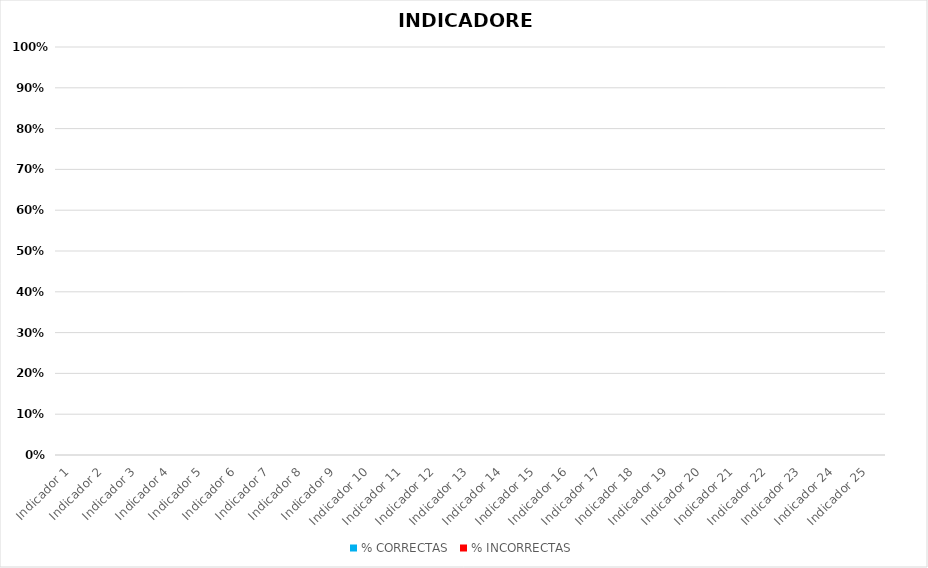
| Category | % CORRECTAS | % INCORRECTAS |
|---|---|---|
| Indicador 1 | 0 | 0 |
| Indicador 2 | 0 | 0 |
| Indicador 3 | 0 | 0 |
| Indicador 4 | 0 | 0 |
| Indicador 5 | 0 | 0 |
| Indicador 6 | 0 | 0 |
| Indicador 7 | 0 | 0 |
| Indicador 8 | 0 | 0 |
| Indicador 9 | 0 | 0 |
| Indicador 10 | 0 | 0 |
| Indicador 11 | 0 | 0 |
| Indicador 12 | 0 | 0 |
| Indicador 13 | 0 | 0 |
| Indicador 14 | 0 | 0 |
| Indicador 15 | 0 | 0 |
| Indicador 16 | 0 | 0 |
| Indicador 17 | 0 | 0 |
| Indicador 18 | 0 | 0 |
| Indicador 19 | 0 | 0 |
| Indicador 20 | 0 | 0 |
| Indicador 21 | 0 | 0 |
| Indicador 22 | 0 | 0 |
| Indicador 23 | 0 | 0 |
| Indicador 24 | 0 | 0 |
| Indicador 25 | 0 | 0 |